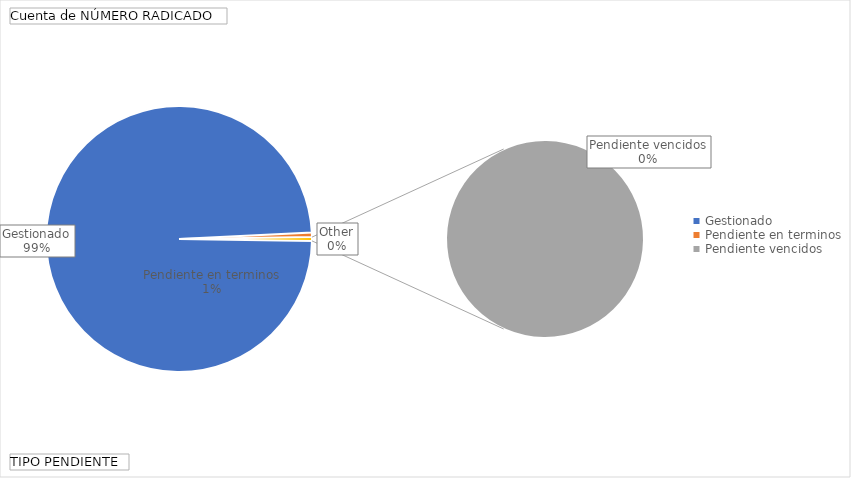
| Category | Total |
|---|---|
| Gestionado | 1096 |
| Pendiente en terminos | 6 |
| Pendiente vencidos | 5 |